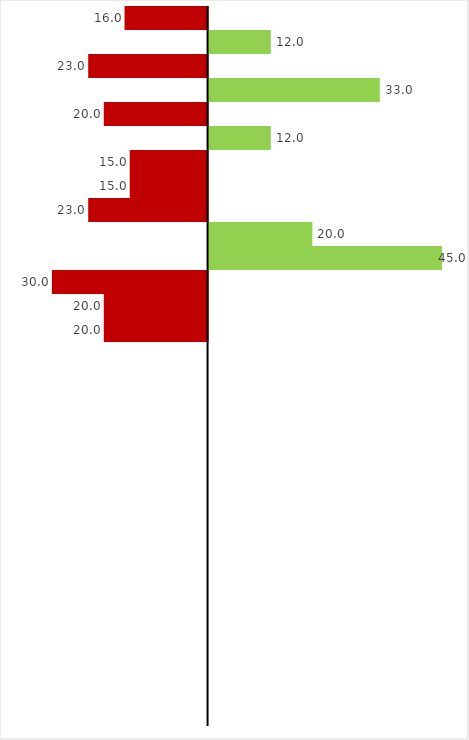
| Category | Activity description |
|---|---|
| 1.0 | -16 |
| 2.0 | 12 |
| 3.0 | -23 |
| 4.0 | 33 |
| 5.0 | -20 |
| 6.0 | 12 |
| 7.0 | -15 |
| 8.0 | -15 |
| 9.0 | -23 |
| 10.0 | 20 |
| 11.0 | 45 |
| 12.0 | -30 |
| 13.0 | -20 |
| 14.0 | -20 |
| 15.0 | 0 |
| 16.0 | 0 |
| 17.0 | 0 |
| 18.0 | 0 |
| 19.0 | 0 |
| 20.0 | 0 |
| 21.0 | 0 |
| 22.0 | 0 |
| 23.0 | 0 |
| 24.0 | 0 |
| 25.0 | 0 |
| 26.0 | 0 |
| 27.0 | 0 |
| 28.0 | 0 |
| 29.0 | 0 |
| 30.0 | 0 |